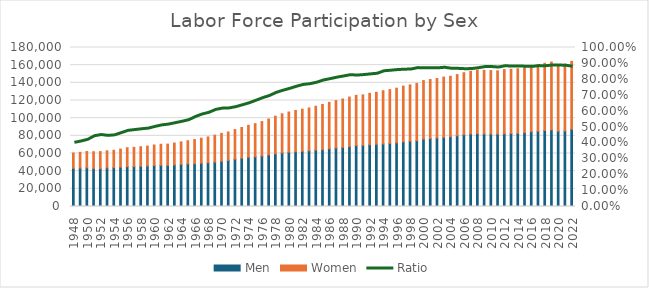
| Category | Men | Women |
|---|---|---|
| 1948.0 | 43286 | 17335 |
| 1949.0 | 43498 | 17788 |
| 1950.0 | 43819 | 18389 |
| 1951.0 | 43001 | 19016 |
| 1952.0 | 42869 | 19269 |
| 1953.0 | 43633 | 19382 |
| 1954.0 | 43965 | 19678 |
| 1955.0 | 44475 | 20548 |
| 1956.0 | 45091 | 21461 |
| 1957.0 | 45197 | 21732 |
| 1958.0 | 45521 | 22118 |
| 1959.0 | 45886 | 22483 |
| 1960.0 | 46388 | 23240 |
| 1961.0 | 46653 | 23806 |
| 1962.0 | 46600 | 24014 |
| 1963.0 | 47129 | 24704 |
| 1964.0 | 47679 | 25412 |
| 1965.0 | 48255 | 26200 |
| 1966.0 | 48471 | 27299 |
| 1967.0 | 48987 | 28360 |
| 1968.0 | 49533 | 29204 |
| 1969.0 | 50221 | 30513 |
| 1970.0 | 51228 | 31543 |
| 1971.0 | 52180 | 32202 |
| 1972.0 | 53555 | 33479 |
| 1973.0 | 54624 | 34804 |
| 1974.0 | 55739 | 36211 |
| 1975.0 | 56299 | 37475 |
| 1976.0 | 57174 | 38983 |
| 1977.0 | 58396 | 40613 |
| 1978.0 | 59620 | 42631 |
| 1979.0 | 60726 | 44235 |
| 1980.0 | 61453 | 45487 |
| 1981.0 | 61974 | 46696 |
| 1982.0 | 62450 | 47755 |
| 1983.0 | 63047 | 48503 |
| 1984.0 | 63835 | 49709 |
| 1985.0 | 64411 | 51050 |
| 1986.0 | 65422 | 52413 |
| 1987.0 | 66207 | 53658 |
| 1988.0 | 66927 | 54742 |
| 1989.0 | 67840 | 56030 |
| 1990.0 | 69011 | 56829 |
| 1991.0 | 69168 | 57178 |
| 1992.0 | 69964 | 58141 |
| 1993.0 | 70404 | 58795 |
| 1994.0 | 70817 | 60239 |
| 1995.0 | 71360 | 60944 |
| 1996.0 | 72087 | 61857 |
| 1997.0 | 73261 | 63036 |
| 1998.0 | 73959 | 63714 |
| 1999.0 | 74512 | 64855 |
| 2000.0 | 76280 | 66303 |
| 2001.0 | 76886 | 66848 |
| 2002.0 | 77500 | 67363 |
| 2003.0 | 78238 | 68272 |
| 2004.0 | 78980 | 68421 |
| 2005.0 | 80033 | 69288 |
| 2006.0 | 81255 | 70173 |
| 2007.0 | 82136 | 70988 |
| 2008.0 | 82520 | 71767 |
| 2009.0 | 82123 | 72019 |
| 2010.0 | 81985 | 71904 |
| 2011.0 | 81975 | 71642 |
| 2012.0 | 82327 | 72648 |
| 2013.0 | 82667 | 72722 |
| 2014.0 | 82882 | 73039 |
| 2015.0 | 83620 | 73510 |
| 2016.0 | 84755 | 74432 |
| 2017.0 | 85145 | 75175 |
| 2018.0 | 86096 | 75978 |
| 2019.0 | 86687 | 76852 |
| 2020.0 | 85204 | 75538 |
| 2021.0 | 85505 | 75699 |
| 2022.0 | 87421 | 76866 |